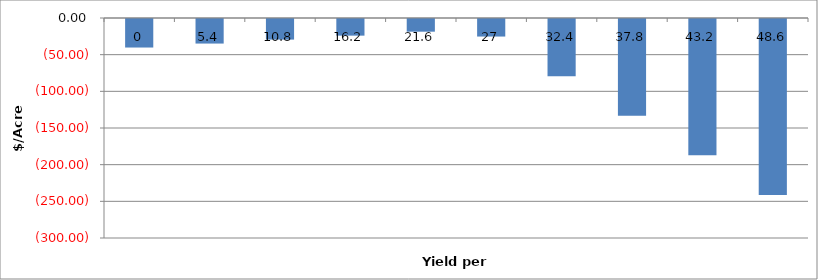
| Category | Series 0 |
|---|---|
| 0.0 | -38.901 |
| 5.4 | -33.501 |
| 10.8 | -28.101 |
| 16.2 | -22.701 |
| 21.6 | -17.301 |
| 27.0 | -23.932 |
| 32.4 | -77.932 |
| 37.8 | -131.932 |
| 43.2 | -185.932 |
| 48.6 | -239.932 |